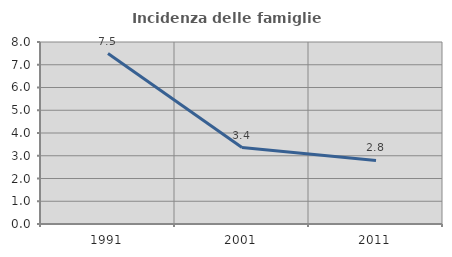
| Category | Incidenza delle famiglie numerose |
|---|---|
| 1991.0 | 7.494 |
| 2001.0 | 3.359 |
| 2011.0 | 2.796 |